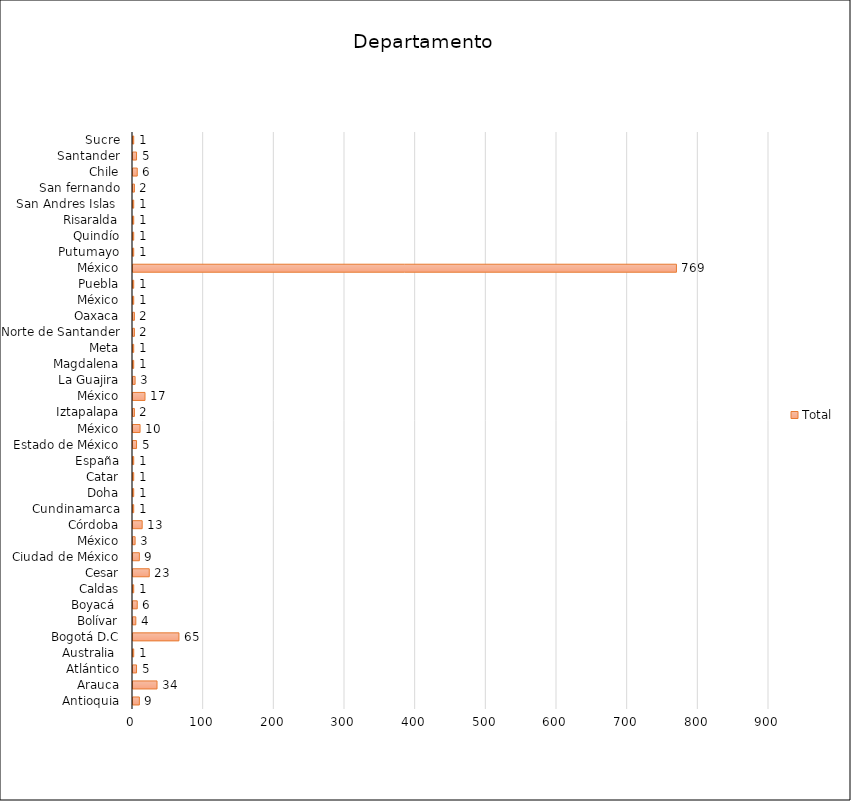
| Category | Total |
|---|---|
| Antioquia | 9 |
| Arauca | 34 |
| Atlántico | 5 |
| Australia  | 1 |
| Bogotá D.C | 65 |
| Bolívar | 4 |
| Boyacá  | 6 |
| Caldas | 1 |
| Cesar | 23 |
| Ciudad de México, México | 9 |
| Córdoba | 3 |
| Cundinamarca | 13 |
| Doha, Catar | 1 |
| España | 1 |
| Estado de México, México | 1 |
| Iztapalapa, México | 1 |
| La Guajira | 5 |
| Magdalena | 10 |
| Meta | 2 |
| Norte de Santander | 17 |
| Oaxaca, México | 3 |
| Puebla, México | 1 |
| Putumayo | 1 |
| Quindío | 2 |
| Risaralda | 2 |
| San Andres Islas  | 1 |
| San fernando, Chile | 1 |
| Santander | 769 |
| Sucre | 1 |
| Tabasco, México | 1 |
| Táchira, Venezuela | 1 |
| Tamaulipas, México | 1 |
| Tolima | 2 |
| Valle del Cauca | 6 |
| Veracruz, México | 5 |
| Turingia, Alemania | 1 |